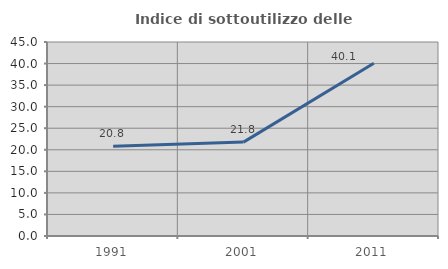
| Category | Indice di sottoutilizzo delle abitazioni  |
|---|---|
| 1991.0 | 20.824 |
| 2001.0 | 21.776 |
| 2011.0 | 40.05 |